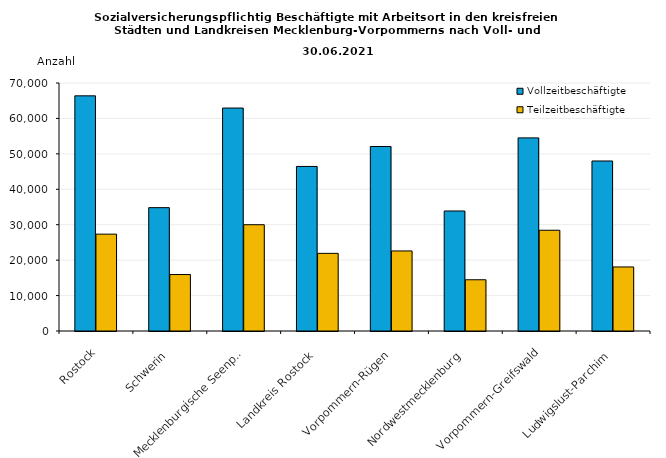
| Category | Vollzeitbeschäftigte | Teilzeitbeschäftigte |
|---|---|---|
|    Rostock | 66376 | 27335 |
|    Schwerin | 34817 | 15935 |
|    Mecklenburgische Seenplatte | 62933 | 30000 |
|    Landkreis Rostock | 46447 | 21914 |
|    Vorpommern-Rügen | 52074 | 22595 |
|    Nordwestmecklenburg | 33871 | 14462 |
|    Vorpommern-Greifswald | 54507 | 28441 |
|    Ludwigslust-Parchim | 47987 | 18082 |